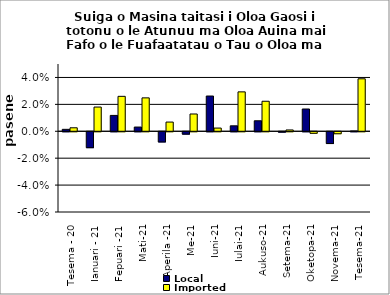
| Category | Local | Imported |
|---|---|---|
| Tesema - 20 | 0.001 | 0.003 |
| Ianuari - 21 | -0.012 | 0.018 |
| Fepuari -21 | 0.012 | 0.026 |
| Mati-21 | 0.003 | 0.025 |
| Aperila -21 | -0.008 | 0.007 |
| Me-21 | -0.002 | 0.013 |
| Iuni-21 | 0.026 | 0.002 |
| Iulai-21 | 0.004 | 0.029 |
| Aukuso-21 | 0.008 | 0.022 |
| Setema-21 | 0 | 0.001 |
| Oketopa-21 | 0.017 | -0.001 |
| Novema-21 | -0.009 | -0.001 |
| Tesema-21 | 0 | 0.039 |